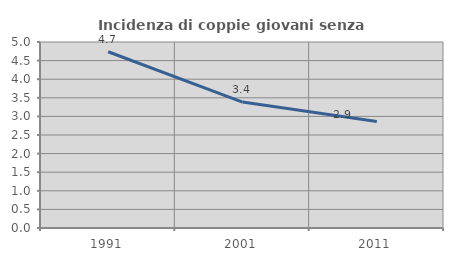
| Category | Incidenza di coppie giovani senza figli |
|---|---|
| 1991.0 | 4.738 |
| 2001.0 | 3.386 |
| 2011.0 | 2.865 |